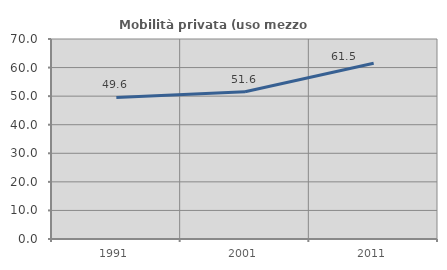
| Category | Mobilità privata (uso mezzo privato) |
|---|---|
| 1991.0 | 49.565 |
| 2001.0 | 51.553 |
| 2011.0 | 61.538 |